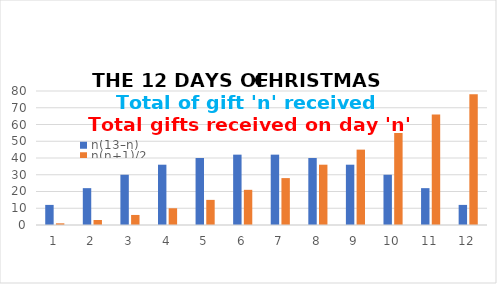
| Category | n(13–n) | n(n+1)/2 |
|---|---|---|
| 1.0 | 12 | 1 |
| 2.0 | 22 | 3 |
| 3.0 | 30 | 6 |
| 4.0 | 36 | 10 |
| 5.0 | 40 | 15 |
| 6.0 | 42 | 21 |
| 7.0 | 42 | 28 |
| 8.0 | 40 | 36 |
| 9.0 | 36 | 45 |
| 10.0 | 30 | 55 |
| 11.0 | 22 | 66 |
| 12.0 | 12 | 78 |